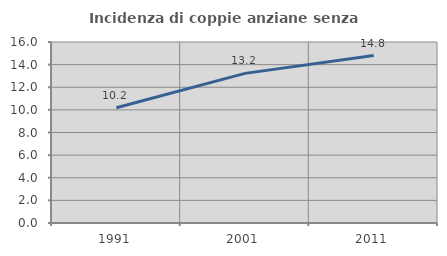
| Category | Incidenza di coppie anziane senza figli  |
|---|---|
| 1991.0 | 10.184 |
| 2001.0 | 13.227 |
| 2011.0 | 14.798 |